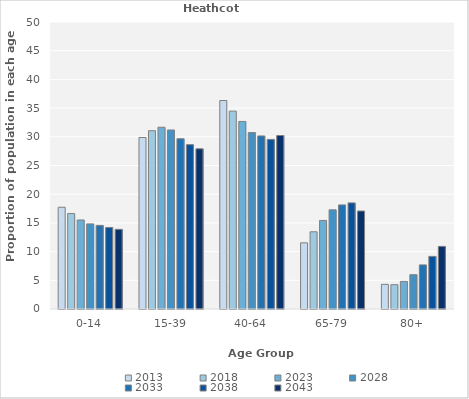
| Category | 2013 | 2018 | 2023 | 2028 | 2033 | 2038 | 2043 |
|---|---|---|---|---|---|---|---|
| 0-14 | 17.727 | 16.627 | 15.504 | 14.828 | 14.563 | 14.205 | 13.878 |
| 15-39 | 29.876 | 31.059 | 31.667 | 31.188 | 29.658 | 28.636 | 27.909 |
| 40-64 | 36.322 | 34.471 | 32.674 | 30.728 | 30.152 | 29.545 | 30.228 |
| 65-79 | 11.529 | 13.451 | 15.426 | 17.28 | 18.137 | 18.485 | 17.072 |
| 80+ | 4.298 | 4.235 | 4.806 | 5.977 | 7.681 | 9.167 | 10.913 |